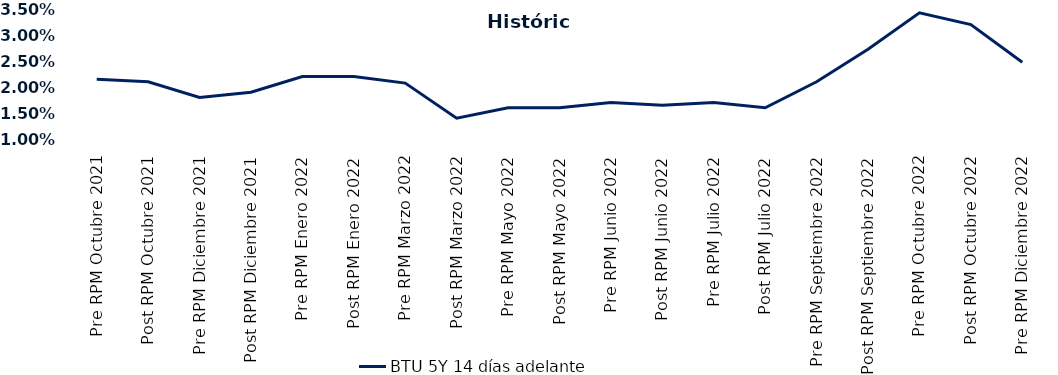
| Category | BTU 5Y 14 días adelante |
|---|---|
| Pre RPM Octubre 2021 | 0.022 |
| Post RPM Octubre 2021 | 0.021 |
| Pre RPM Diciembre 2021 | 0.018 |
| Post RPM Diciembre 2021 | 0.019 |
| Pre RPM Enero 2022 | 0.022 |
| Post RPM Enero 2022 | 0.022 |
| Pre RPM Marzo 2022 | 0.021 |
| Post RPM Marzo 2022 | 0.014 |
| Pre RPM Mayo 2022 | 0.016 |
| Post RPM Mayo 2022 | 0.016 |
| Pre RPM Junio 2022 | 0.017 |
| Post RPM Junio 2022 | 0.016 |
| Pre RPM Julio 2022 | 0.017 |
| Post RPM Julio 2022 | 0.016 |
| Pre RPM Septiembre 2022 | 0.021 |
| Post RPM Septiembre 2022 | 0.027 |
| Pre RPM Octubre 2022 | 0.034 |
| Post RPM Octubre 2022 | 0.032 |
| Pre RPM Diciembre 2022 | 0.025 |